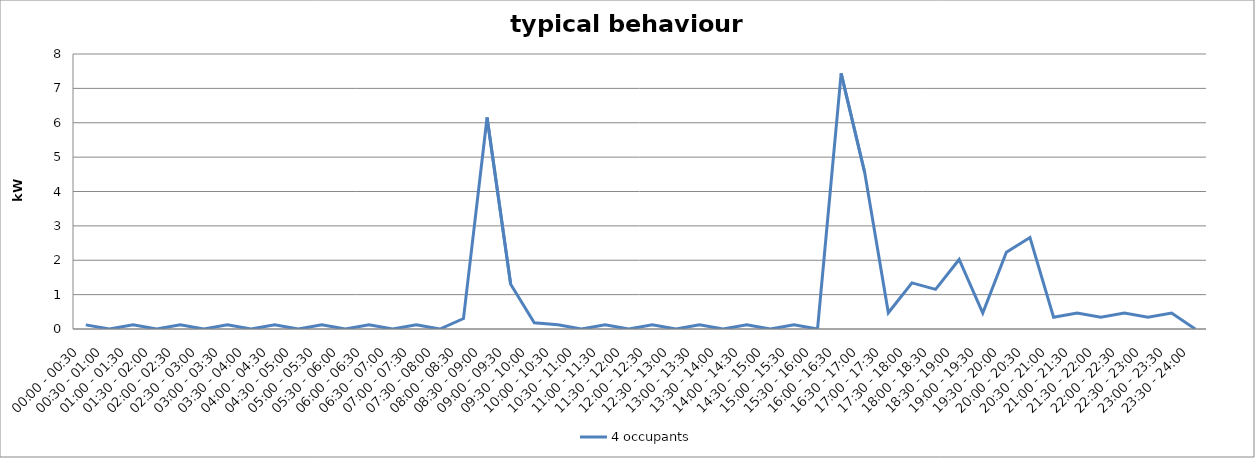
| Category | 4 occupants |
|---|---|
| 00:00 - 00:30 | 0.121 |
| 00:30 - 01:00 | 0 |
| 01:00 - 01:30 | 0.121 |
| 01:30 - 02:00 | 0 |
| 02:00 - 02:30 | 0.121 |
| 02:30 - 03:00 | 0 |
| 03:00 - 03:30 | 0.121 |
| 03:30 - 04:00 | 0 |
| 04:00 - 04:30 | 0.121 |
| 04:30 - 05:00 | 0 |
| 05:00 - 05:30 | 0.121 |
| 05:30 - 06:00 | 0 |
| 06:00 - 06:30 | 0.121 |
| 06:30 - 07:00 | 0 |
| 07:00 - 07:30 | 0.121 |
| 07:30 - 08:00 | 0 |
| 08:00 - 08:30 | 0.303 |
| 08:30 - 09:00 | 6.153 |
| 09:00 - 09:30 | 1.302 |
| 09:30 - 10:00 | 0.183 |
| 10:00 - 10:30 | 0.121 |
| 10:30 - 11:00 | 0 |
| 11:00 - 11:30 | 0.121 |
| 11:30 - 12:00 | 0 |
| 12:00 - 12:30 | 0.121 |
| 12:30 - 13:00 | 0 |
| 13:00 - 13:30 | 0.121 |
| 13:30 - 14:00 | 0 |
| 14:00 - 14:30 | 0.121 |
| 14:30 - 15:00 | 0 |
| 15:00 - 15:30 | 0.121 |
| 15:30 - 16:00 | 0 |
| 16:00 - 16:30 | 7.437 |
| 16:30 - 17:00 | 4.546 |
| 17:00 - 17:30 | 0.471 |
| 17:30 - 18:00 | 1.342 |
| 18:00 - 18:30 | 1.153 |
| 18:30 - 19:00 | 2.023 |
| 19:00 - 19:30 | 0.463 |
| 19:30 - 20:00 | 2.233 |
| 20:00 - 20:30 | 2.663 |
| 20:30 - 21:00 | 0.343 |
| 21:00 - 21:30 | 0.463 |
| 21:30 - 22:00 | 0.343 |
| 22:00 - 22:30 | 0.463 |
| 22:30 - 23:00 | 0.343 |
| 23:00 - 23:30 | 0.463 |
| 23:30 - 24:00 | 0 |